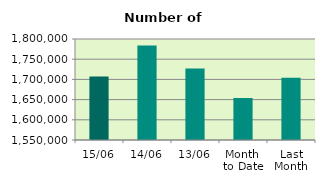
| Category | Series 0 |
|---|---|
| 15/06 | 1707264 |
| 14/06 | 1783604 |
| 13/06 | 1726756 |
| Month 
to Date | 1653894 |
| Last
Month | 1704183.636 |